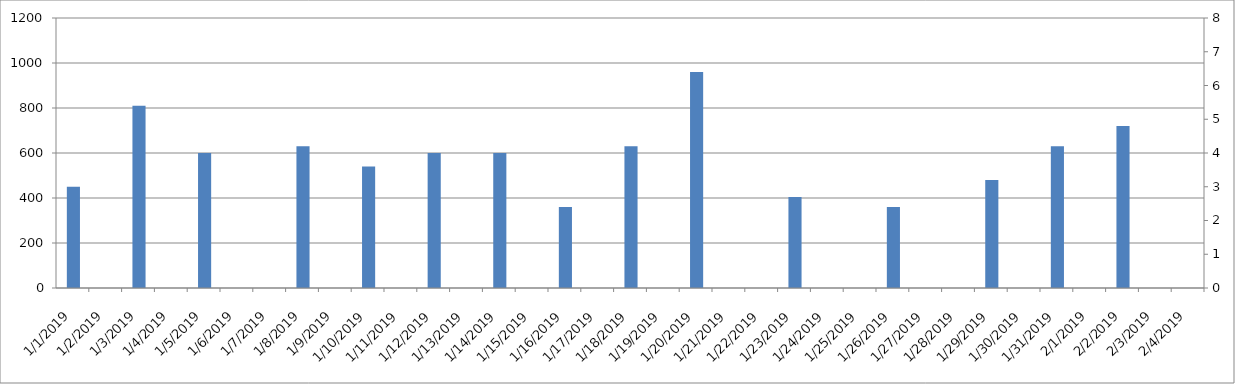
| Category | Series 0 |
|---|---|
| 1/1/19 | 450 |
| 1/2/19 | 0 |
| 1/3/19 | 810 |
| 1/4/19 | 0 |
| 1/5/19 | 600 |
| 1/6/19 | 0 |
| 1/7/19 | 0 |
| 1/8/19 | 630 |
| 1/9/19 | 0 |
| 1/10/19 | 540 |
| 1/11/19 | 0 |
| 1/12/19 | 600 |
| 1/13/19 | 0 |
| 1/14/19 | 600 |
| 1/15/19 | 0 |
| 1/16/19 | 360 |
| 1/17/19 | 0 |
| 1/18/19 | 630 |
| 1/19/19 | 0 |
| 1/20/19 | 960 |
| 1/21/19 | 0 |
| 1/22/19 | 0 |
| 1/23/19 | 405 |
| 1/24/19 | 0 |
| 1/25/19 | 0 |
| 1/26/19 | 360 |
| 1/27/19 | 0 |
| 1/28/19 | 0 |
| 1/29/19 | 480 |
| 1/30/19 | 0 |
| 1/31/19 | 630 |
| 2/1/19 | 0 |
| 2/2/19 | 720 |
| 2/3/19 | 0 |
| 2/4/19 | 0 |